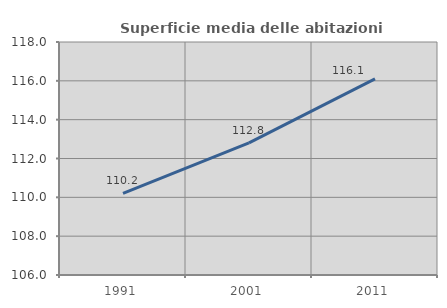
| Category | Superficie media delle abitazioni occupate |
|---|---|
| 1991.0 | 110.199 |
| 2001.0 | 112.802 |
| 2011.0 | 116.103 |